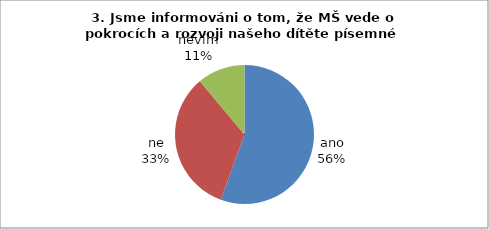
| Category | 3. |
|---|---|
| ano | 30 |
| ne | 18 |
| nevím | 6 |